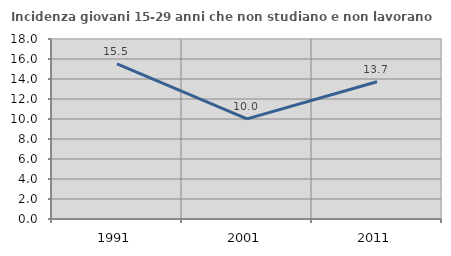
| Category | Incidenza giovani 15-29 anni che non studiano e non lavorano  |
|---|---|
| 1991.0 | 15.521 |
| 2001.0 | 10.013 |
| 2011.0 | 13.728 |